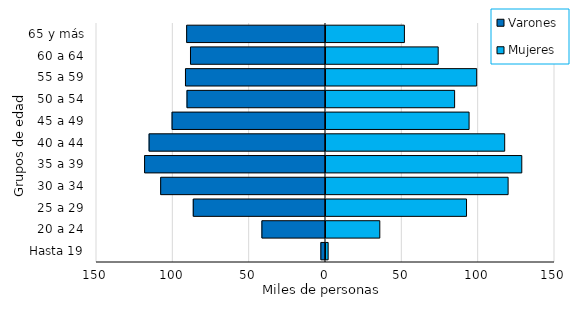
| Category | Varones | Mujeres |
|---|---|---|
| Hasta 19 | -3030 | 2061 |
| 20 a 24 | -41651 | 35902 |
| 25 a 29 | -86613 | 92704 |
| 30 a 34 | -107962 | 119941 |
| 35 a 39 | -118498 | 128902 |
| 40 a 44 | -115547 | 117703 |
| 45 a 49 | -100487 | 94377 |
| 50 a 54 | -90717 | 84898 |
| 55 a 59 | -91718 | 99365 |
| 60 a 64 | -88432 | 74142 |
| 65 y más | -90943 | 52019 |